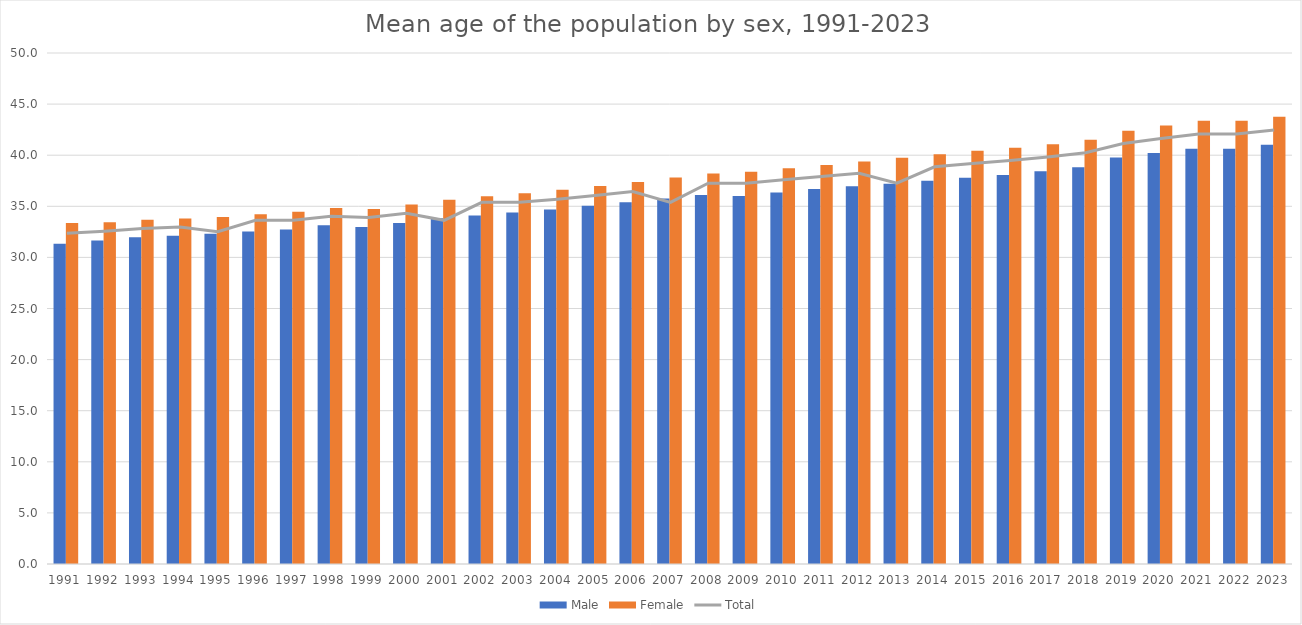
| Category | Male | Female |
|---|---|---|
| 1991.0 | 31.338 | 33.363 |
| 1992.0 | 31.656 | 33.445 |
| 1993.0 | 31.963 | 33.681 |
| 1994.0 | 32.125 | 33.81 |
| 1995.0 | 32.31 | 33.951 |
| 1996.0 | 32.532 | 34.211 |
| 1997.0 | 32.736 | 34.463 |
| 1998.0 | 33.146 | 34.841 |
| 1999.0 | 32.974 | 34.746 |
| 2000.0 | 33.368 | 35.172 |
| 2001.0 | 33.834 | 35.642 |
| 2002.0 | 34.108 | 35.972 |
| 2003.0 | 34.401 | 36.285 |
| 2004.0 | 34.683 | 36.62 |
| 2005.0 | 35.048 | 36.985 |
| 2006.0 | 35.394 | 37.386 |
| 2007.0 | 35.755 | 37.808 |
| 2008.0 | 36.118 | 38.214 |
| 2009.0 | 36.009 | 38.393 |
| 2010.0 | 36.339 | 38.721 |
| 2011.0 | 36.681 | 39.041 |
| 2012.0 | 36.963 | 39.379 |
| 2013.0 | 37.213 | 39.758 |
| 2014.0 | 37.498 | 40.095 |
| 2015.0 | 37.784 | 40.427 |
| 2016.0 | 38.071 | 40.741 |
| 2017.0 | 38.437 | 41.064 |
| 2018.0 | 38.818 | 41.514 |
| 2019.0 | 39.767 | 42.387 |
| 2020.0 | 40.206 | 42.907 |
| 2021.0 | 40.627 | 43.365 |
| 2022.0 | 40.627 | 43.365 |
| 2023.0 | 41.013 | 43.771 |